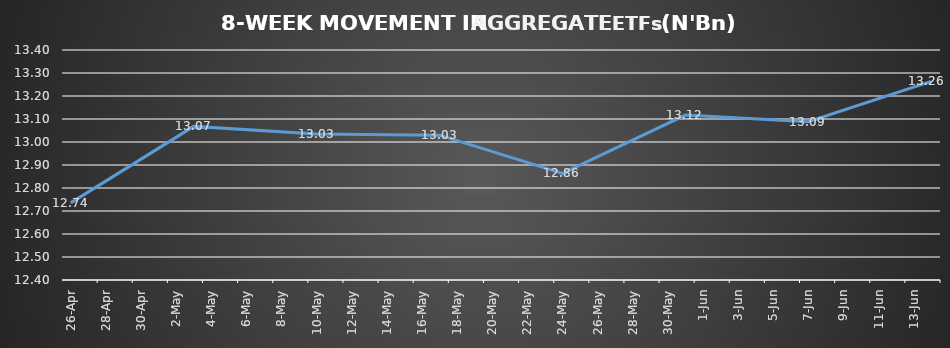
| Category | ETFs AGGREGATE |
|---|---|
| 2024-04-26 | 12.735 |
| 2024-05-03 | 13.068 |
| 2024-05-10 | 13.034 |
| 2024-05-17 | 13.03 |
| 2024-05-24 | 12.863 |
| 2024-05-31 | 13.117 |
| 2024-06-07 | 13.088 |
| 2024-06-14 | 13.263 |